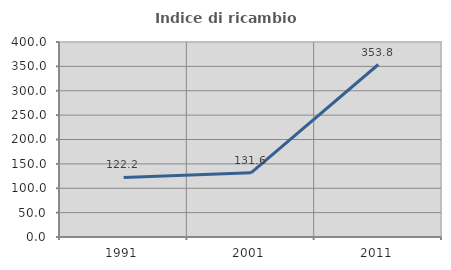
| Category | Indice di ricambio occupazionale  |
|---|---|
| 1991.0 | 122.222 |
| 2001.0 | 131.579 |
| 2011.0 | 353.846 |